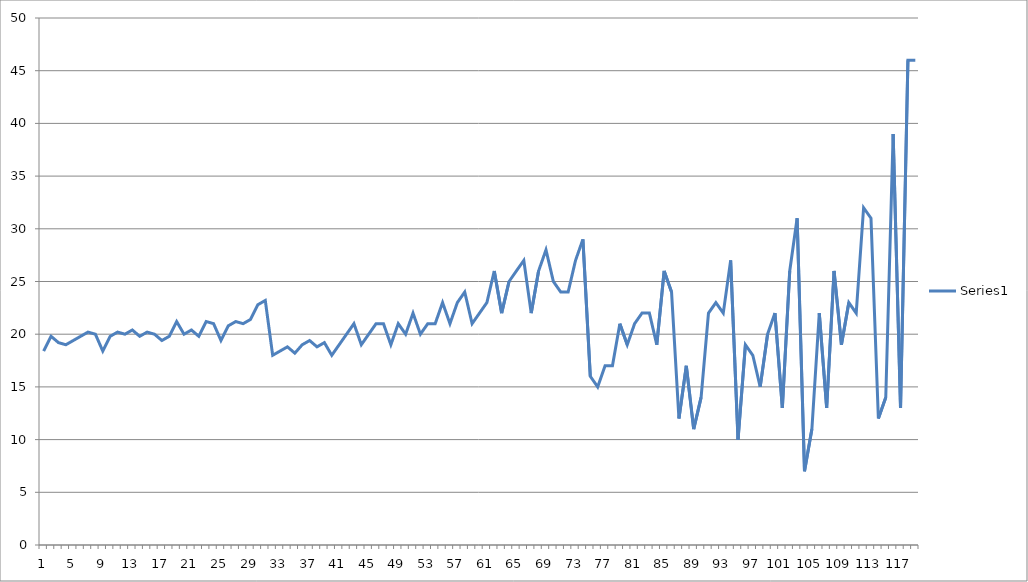
| Category | Series 0 |
|---|---|
| 0 | 18.4 |
| 1 | 19.8 |
| 2 | 19.2 |
| 3 | 19 |
| 4 | 19.4 |
| 5 | 19.8 |
| 6 | 20.2 |
| 7 | 20 |
| 8 | 18.4 |
| 9 | 19.8 |
| 10 | 20.2 |
| 11 | 20 |
| 12 | 20.4 |
| 13 | 19.8 |
| 14 | 20.2 |
| 15 | 20 |
| 16 | 19.4 |
| 17 | 19.8 |
| 18 | 21.2 |
| 19 | 20 |
| 20 | 20.4 |
| 21 | 19.8 |
| 22 | 21.2 |
| 23 | 21 |
| 24 | 19.4 |
| 25 | 20.8 |
| 26 | 21.2 |
| 27 | 21 |
| 28 | 21.4 |
| 29 | 22.8 |
| 30 | 23.2 |
| 31 | 18 |
| 32 | 18.4 |
| 33 | 18.8 |
| 34 | 18.2 |
| 35 | 19 |
| 36 | 19.4 |
| 37 | 18.8 |
| 38 | 19.2 |
| 39 | 18 |
| 40 | 19 |
| 41 | 20 |
| 42 | 21 |
| 43 | 19 |
| 44 | 20 |
| 45 | 21 |
| 46 | 21 |
| 47 | 19 |
| 48 | 21 |
| 49 | 20 |
| 50 | 22 |
| 51 | 20 |
| 52 | 21 |
| 53 | 21 |
| 54 | 23 |
| 55 | 21 |
| 56 | 23 |
| 57 | 24 |
| 58 | 21 |
| 59 | 22 |
| 60 | 23 |
| 61 | 26 |
| 62 | 22 |
| 63 | 25 |
| 64 | 26 |
| 65 | 27 |
| 66 | 22 |
| 67 | 26 |
| 68 | 28 |
| 69 | 25 |
| 70 | 24 |
| 71 | 24 |
| 72 | 27 |
| 73 | 29 |
| 74 | 16 |
| 75 | 15 |
| 76 | 17 |
| 77 | 17 |
| 78 | 21 |
| 79 | 19 |
| 80 | 21 |
| 81 | 22 |
| 82 | 22 |
| 83 | 19 |
| 84 | 26 |
| 85 | 24 |
| 86 | 12 |
| 87 | 17 |
| 88 | 11 |
| 89 | 14 |
| 90 | 22 |
| 91 | 23 |
| 92 | 22 |
| 93 | 27 |
| 94 | 10 |
| 95 | 19 |
| 96 | 18 |
| 97 | 15 |
| 98 | 20 |
| 99 | 22 |
| 100 | 13 |
| 101 | 26 |
| 102 | 31 |
| 103 | 7 |
| 104 | 11 |
| 105 | 22 |
| 106 | 13 |
| 107 | 26 |
| 108 | 19 |
| 109 | 23 |
| 110 | 22 |
| 111 | 32 |
| 112 | 31 |
| 113 | 12 |
| 114 | 14 |
| 115 | 39 |
| 116 | 13 |
| 117 | 46 |
| 118 | 46 |